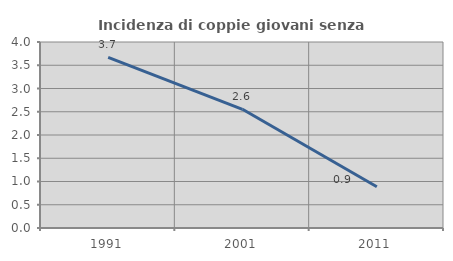
| Category | Incidenza di coppie giovani senza figli |
|---|---|
| 1991.0 | 3.671 |
| 2001.0 | 2.552 |
| 2011.0 | 0.886 |